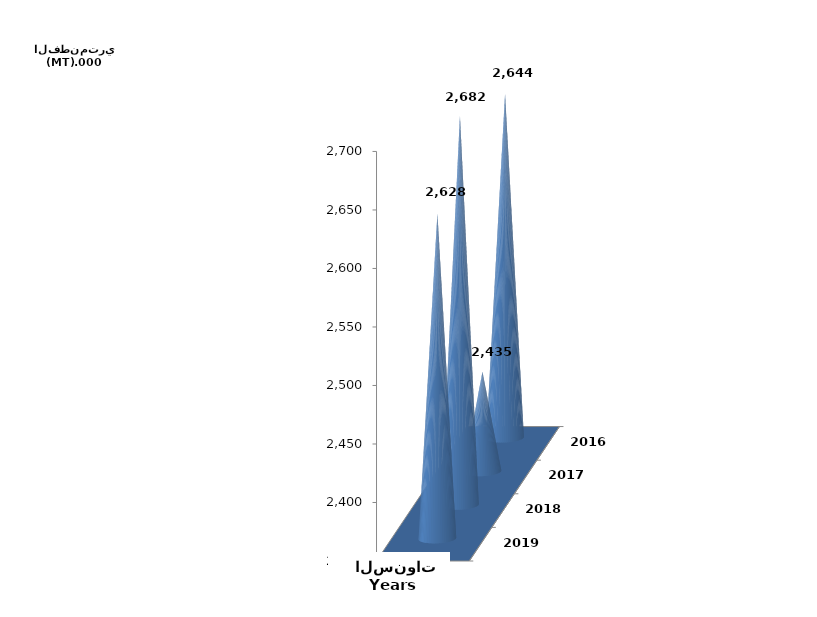
| Category | Series 0 | Series 1 |
|---|---|---|
| 2016 | 2643727.953 |  |
| 2017 | 2435155.083 |  |
| 2018 | 2682336.913 |  |
| 2019 | 2627645.697 |  |